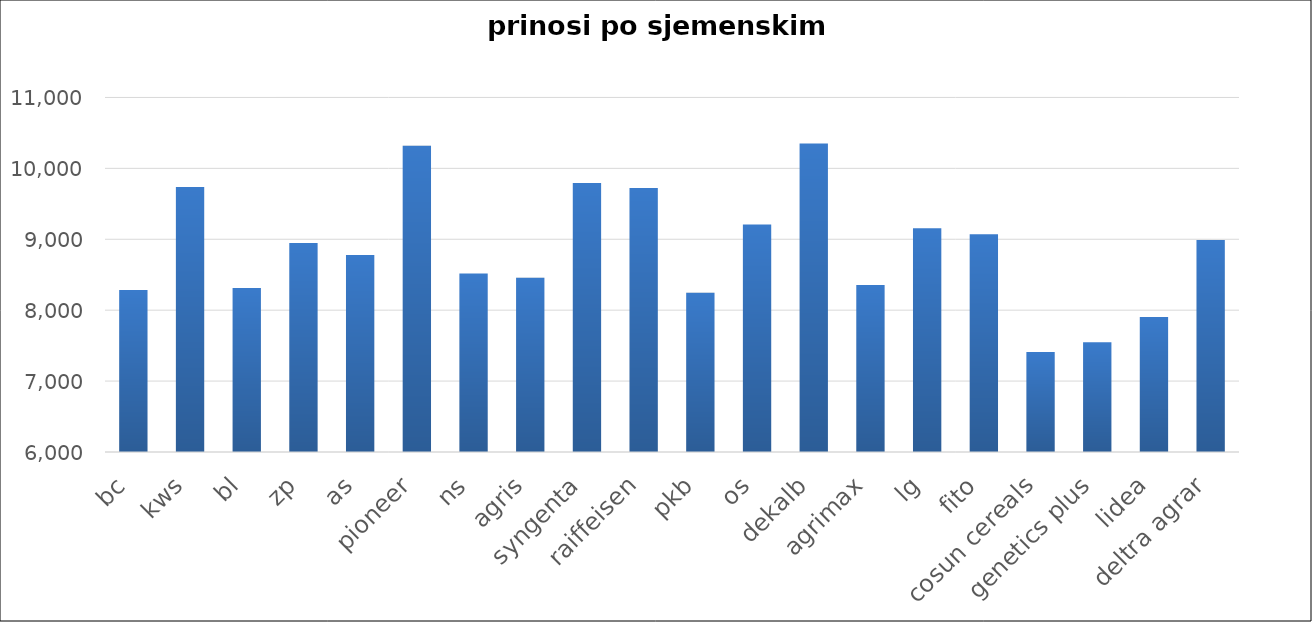
| Category | Series 0 |
|---|---|
| bc | 8284 |
| kws | 9738 |
| bl | 8313 |
| zp | 8949 |
| as | 8779 |
| pioneer | 10320 |
| ns | 8519 |
| agris | 8459 |
| syngenta | 9793 |
| raiffeisen | 9722 |
| pkb | 8247 |
| os | 9210 |
| dekalb | 10352 |
| agrimax | 8354 |
| lg | 9155 |
| fito | 9072 |
| cosun cereals | 7412 |
| genetics plus | 7548 |
| lidea | 7903 |
| deltra agrar | 8989 |